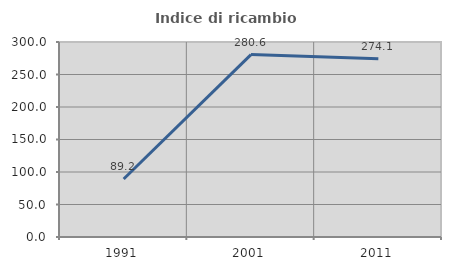
| Category | Indice di ricambio occupazionale  |
|---|---|
| 1991.0 | 89.189 |
| 2001.0 | 280.645 |
| 2011.0 | 274.074 |